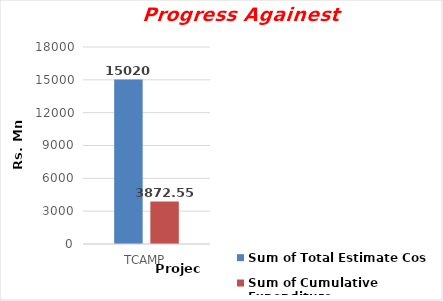
| Category | Sum of Total Estimate Cost | Sum of Cumulative Expenditure  |
|---|---|---|
| TCAMP | 15020 | 3872.55 |